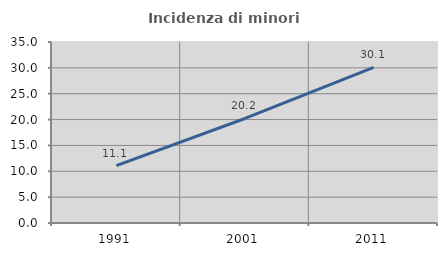
| Category | Incidenza di minori stranieri |
|---|---|
| 1991.0 | 11.111 |
| 2001.0 | 20.213 |
| 2011.0 | 30.114 |